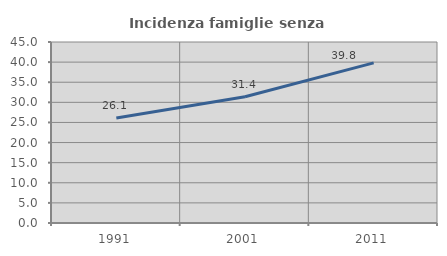
| Category | Incidenza famiglie senza nuclei |
|---|---|
| 1991.0 | 26.087 |
| 2001.0 | 31.395 |
| 2011.0 | 39.806 |